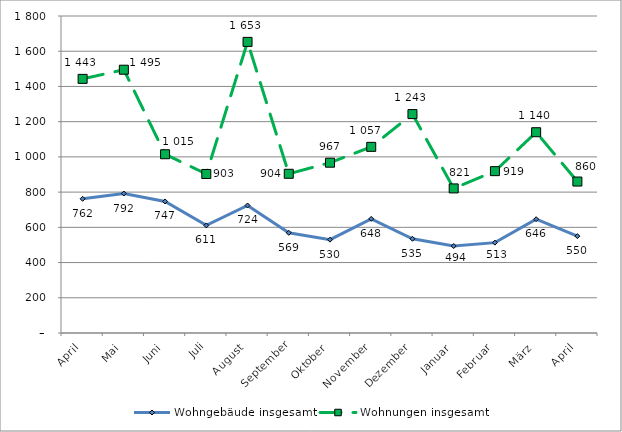
| Category | Wohngebäude insgesamt | Wohnungen insgesamt |
|---|---|---|
| April | 762 | 1443 |
| Mai | 792 | 1495 |
| Juni | 747 | 1015 |
| Juli | 611 | 903 |
| August | 724 | 1653 |
| September | 569 | 904 |
| Oktober | 530 | 967 |
| November | 648 | 1057 |
| Dezember | 535 | 1243 |
| Januar | 494 | 821 |
| Februar | 513 | 919 |
| März | 646 | 1140 |
| April | 550 | 860 |